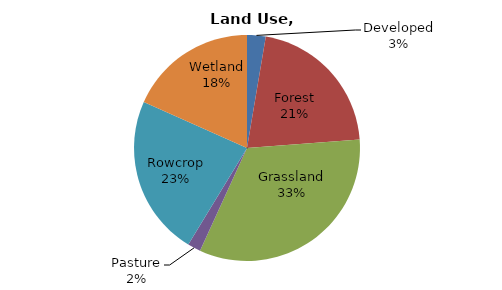
| Category | Series 0 |
|---|---|
| Developed | 56.868 |
| Forest | 450.588 |
| Grassland | 704.831 |
| Pasture | 39.885 |
| Rowcrop | 490.132 |
| Wetland | 391.12 |